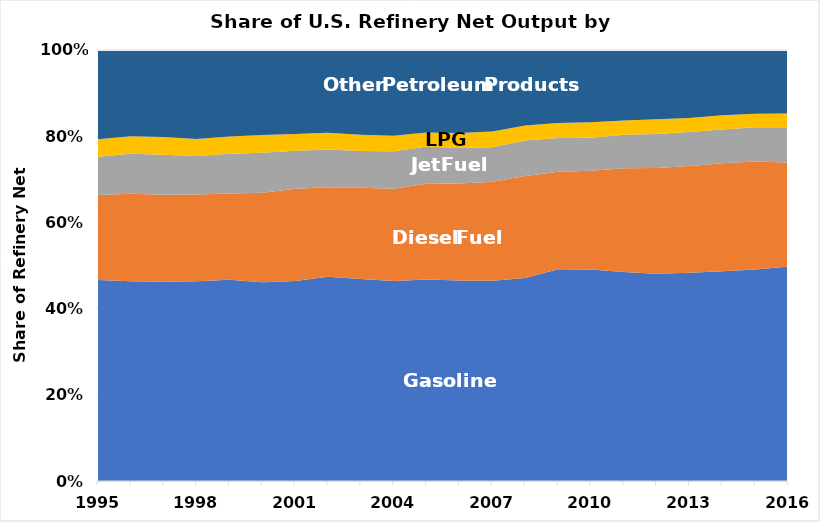
| Category | Gasoline | Diesel Fuel | Jet Fuel | LPG | Other Petroleum Products  |
|---|---|---|---|---|---|
| 1995.0 | 0.466 | 0.197 | 0.089 | 0.041 | 0.207 |
| 1996.0 | 0.463 | 0.203 | 0.093 | 0.041 | 0.2 |
| 1997.0 | 0.462 | 0.202 | 0.093 | 0.041 | 0.202 |
| 1998.0 | 0.463 | 0.201 | 0.09 | 0.04 | 0.206 |
| 1999.0 | 0.467 | 0.2 | 0.092 | 0.04 | 0.201 |
| 2000.0 | 0.461 | 0.208 | 0.093 | 0.041 | 0.197 |
| 2001.0 | 0.464 | 0.214 | 0.088 | 0.039 | 0.195 |
| 2002.0 | 0.474 | 0.208 | 0.088 | 0.039 | 0.192 |
| 2003.0 | 0.469 | 0.212 | 0.085 | 0.038 | 0.197 |
| 2004.0 | 0.464 | 0.214 | 0.087 | 0.036 | 0.199 |
| 2005.0 | 0.467 | 0.222 | 0.087 | 0.032 | 0.192 |
| 2006.0 | 0.465 | 0.225 | 0.082 | 0.035 | 0.193 |
| 2007.0 | 0.464 | 0.23 | 0.08 | 0.036 | 0.189 |
| 2008.0 | 0.471 | 0.237 | 0.082 | 0.035 | 0.175 |
| 2009.0 | 0.491 | 0.226 | 0.078 | 0.035 | 0.169 |
| 2010.0 | 0.491 | 0.229 | 0.077 | 0.036 | 0.168 |
| 2011.0 | 0.485 | 0.241 | 0.078 | 0.033 | 0.164 |
| 2012.0 | 0.481 | 0.245 | 0.079 | 0.034 | 0.161 |
| 2013.0 | 0.483 | 0.248 | 0.078 | 0.033 | 0.158 |
| 2014.0 | 0.487 | 0.25 | 0.078 | 0.033 | 0.151 |
| 2015.0 | 0.49 | 0.251 | 0.08 | 0.031 | 0.148 |
| 2016.0 | 0.498 | 0.241 | 0.082 | 0.032 | 0.148 |